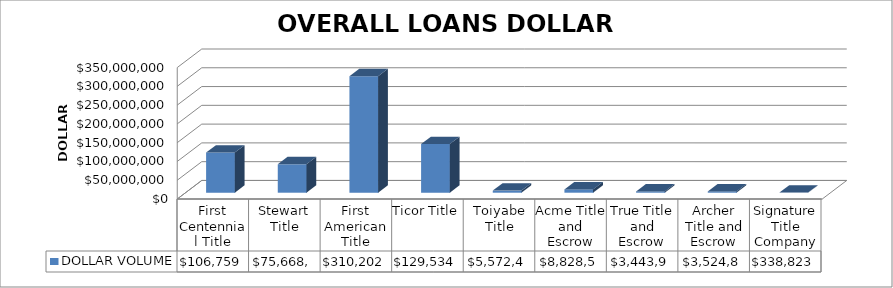
| Category | DOLLAR VOLUME |
|---|---|
| First Centennial Title | 106759226 |
| Stewart Title | 75668611 |
| First American Title | 310202358.75 |
| Ticor Title | 129534643 |
| Toiyabe Title | 5572474 |
| Acme Title and Escrow | 8828537 |
| True Title and Escrow | 3443940 |
| Archer Title and Escrow | 3524832 |
| Signature Title Company | 338823 |